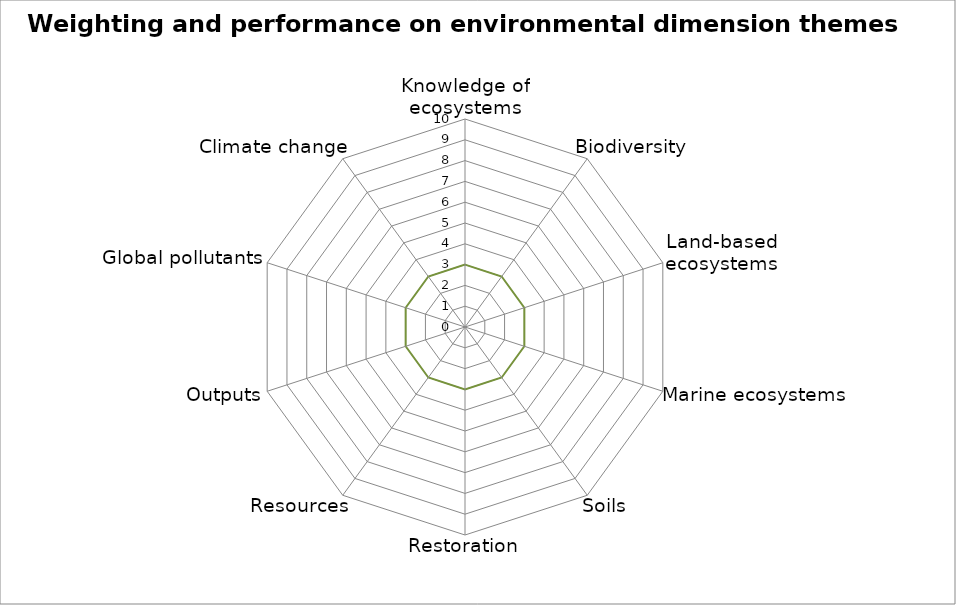
| Category | Performance | Weighting | Series 2 |
|---|---|---|---|
| Knowledge of ecosystems | 0 | 0 | 3 |
| Biodiversity | 0 | 0 | 3 |
| Land-based ecosystems | 0 | 0 | 3 |
| Marine ecosystems | 0 | 0 | 3 |
| Soils | 0 | 0 | 3 |
| Restoration | 0 | 0 | 3 |
| Resources | 0 | 0 | 3 |
| Outputs | 0 | 0 | 3 |
| Global pollutants | 0 | 0 | 3 |
| Climate change  | 0 | 0 | 3 |